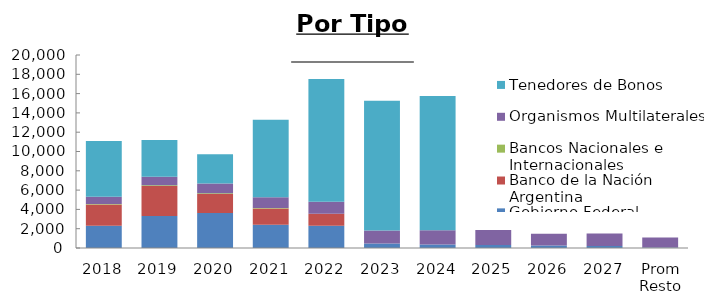
| Category | Gobierno Federal | Banco de la Nación Argentina | Bancos Nacionales e Internacionales | Organismos Multilaterales | Tenedores de Bonos |
|---|---|---|---|---|---|
| 2018 | 2293.088 | 2222.563 | 53.31 | 741.929 | 5780.834 |
| 2019 | 3306.405 | 3115.936 | 72.878 | 892.143 | 3791.789 |
| 2020 | 3636.828 | 1970.833 | 76.686 | 1009.199 | 3025.204 |
| 2021 | 2398.266 | 1702.685 | 41.4 | 1116.24 | 8039.47 |
| 2022 | 2293.99 | 1258.772 | 0 | 1236.992 | 12723.311 |
| 2023 | 465.874 | 0 | 0 | 1354.802 | 13431.861 |
| 2024 | 370.286 | 0 | 0 | 1476.4 | 13908.824 |
| 2025 | 301.285 | 0 | 0 | 1560.519 | 0 |
| 2026 | 255.062 | 0 | 0 | 1209.28 | 0 |
| 2027 | 216.957 | 0 | 0 | 1288.496 | 0 |
| Prom Resto | 39.222 | 0 | 0 | 1046.19 | 0 |